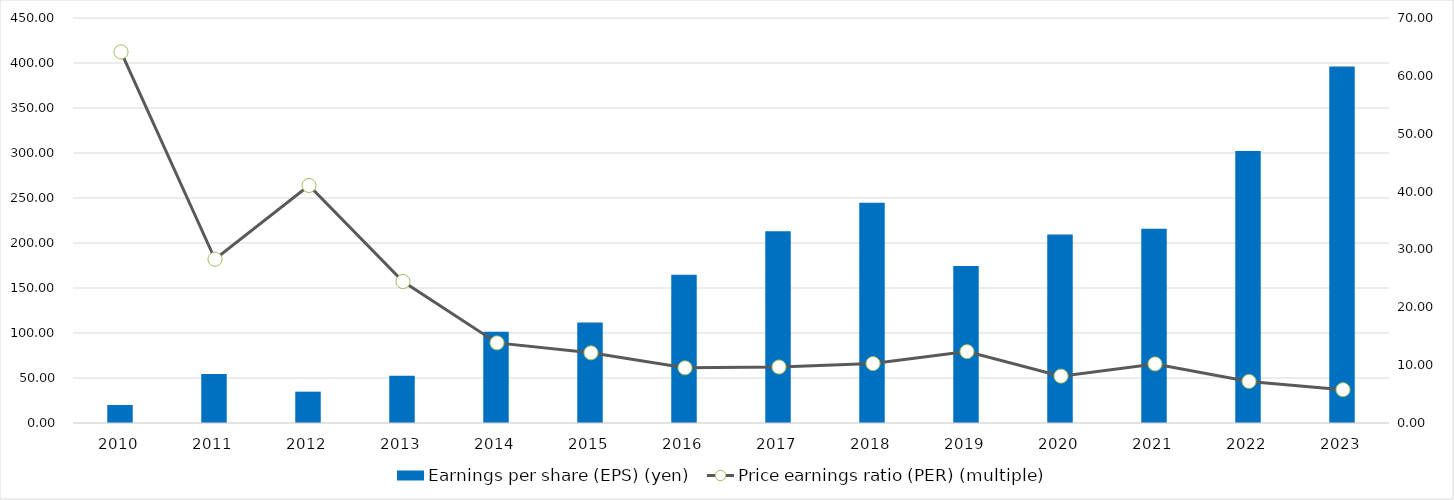
| Category | Earnings per share (EPS) (yen) |
|---|---|
| 2010 | 20.035 |
| 2011 | 54.412 |
| 2012 | 34.83 |
| 2013 | 52.535 |
| 2014 | 101.463 |
| 2015 | 111.698 |
| 2016 | 164.674 |
| 2017 | 212.958 |
| 2018 | 244.599 |
| 2019 | 174.552 |
| 2020 | 209.321 |
| 2021 | 215.83 |
| 2022 | 302.18 |
| 2023 | 396.096 |